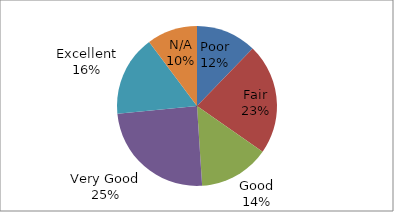
| Category | Series 0 |
|---|---|
| Poor | 6 |
| Fair | 11 |
| Good | 7 |
| Very Good | 12 |
| Excellent | 8 |
| N/A | 5 |